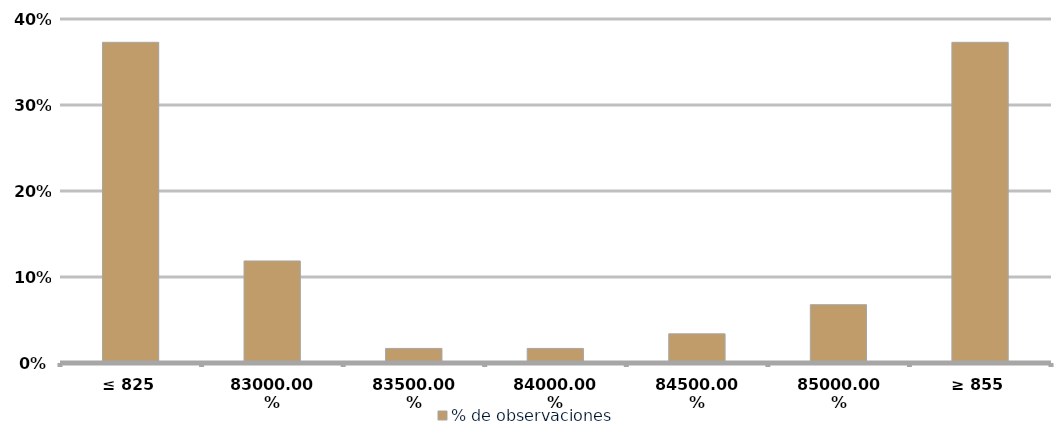
| Category | % de observaciones  |
|---|---|
| ≤ 825 | 0.373 |
| 830 | 0.119 |
| 835 | 0.017 |
| 840 | 0.017 |
| 845 | 0.034 |
| 850 | 0.068 |
| ≥ 855 | 0.373 |